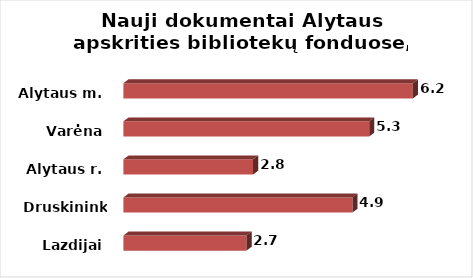
| Category | Series 0 |
|---|---|
| Lazdijai | 2.65 |
| Druskininkai | 4.93 |
| Alytaus r. | 2.79 |
| Varėna | 5.29 |
| Alytaus m. | 6.23 |